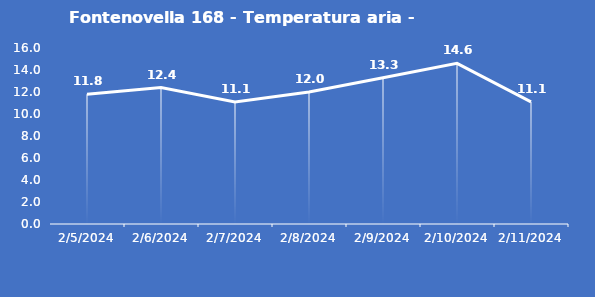
| Category | Fontenovella 168 - Temperatura aria - Grezzo (°C) |
|---|---|
| 2/5/24 | 11.8 |
| 2/6/24 | 12.4 |
| 2/7/24 | 11.1 |
| 2/8/24 | 12 |
| 2/9/24 | 13.3 |
| 2/10/24 | 14.6 |
| 2/11/24 | 11.1 |